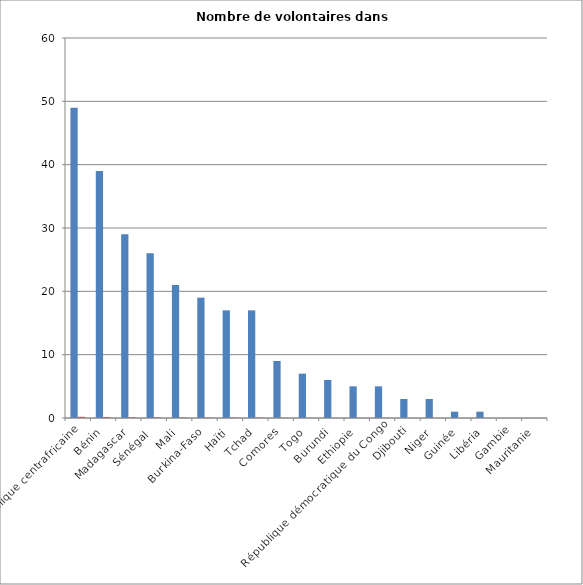
| Category | Nombre de volontaires | % |
|---|---|---|
| République centrafricaine | 49 | 0.191 |
| Bénin | 39 | 0.152 |
| Madagascar | 29 | 0.113 |
| Sénégal  | 26 | 0.101 |
| Mali | 21 | 0.082 |
| Burkina-Faso | 19 | 0.074 |
| Haïti | 17 | 0.066 |
| Tchad | 17 | 0.066 |
| Comores | 9 | 0.035 |
| Togo | 7 | 0.027 |
| Burundi | 6 | 0.023 |
| Ethiopie | 5 | 0.019 |
| République démocratique du Congo | 5 | 0.019 |
| Djibouti | 3 | 0.012 |
| Niger | 3 | 0.012 |
| Guinée | 1 | 0.004 |
| Libéria | 1 | 0.004 |
| Gambie | 0 | 0 |
| Mauritanie | 0 | 0 |